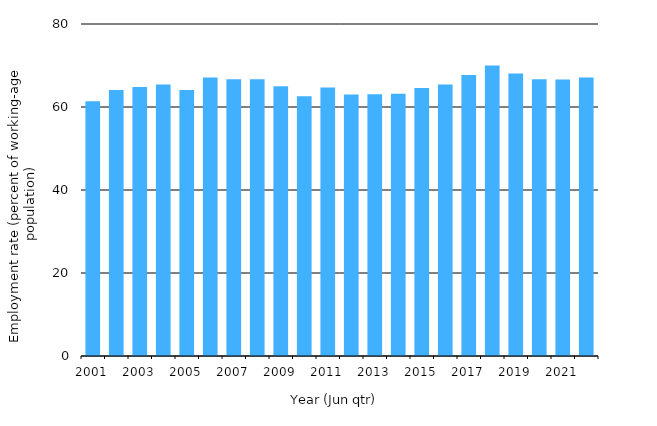
| Category | Employment rate (percent of working-age population) |
|---|---|
| 2001.0 | 61.4 |
| 2002.0 | 64.1 |
| 2003.0 | 64.8 |
| 2004.0 | 65.4 |
| 2005.0 | 64.1 |
| 2006.0 | 67.1 |
| 2007.0 | 66.7 |
| 2008.0 | 66.7 |
| 2009.0 | 65 |
| 2010.0 | 62.6 |
| 2011.0 | 64.7 |
| 2012.0 | 63 |
| 2013.0 | 63.1 |
| 2014.0 | 63.2 |
| 2015.0 | 64.6 |
| 2016.0 | 65.4 |
| 2017.0 | 67.7 |
| 2018.0 | 70 |
| 2019.0 | 68.1 |
| 2020.0 | 66.7 |
| 2021.0 | 66.6 |
| 2022.0 | 67.1 |